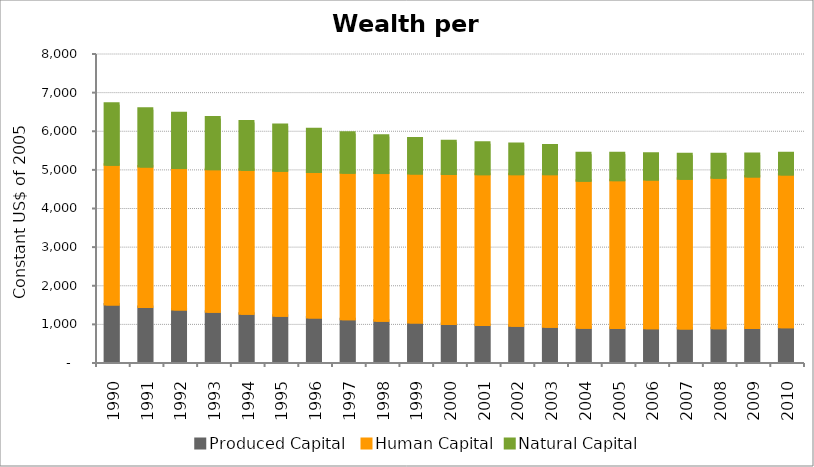
| Category | Produced Capital  | Human Capital | Natural Capital |
|---|---|---|---|
| 1990.0 | 1491.682 | 3614.805 | 1581.04 |
| 1991.0 | 1425.109 | 3634.624 | 1499.157 |
| 1992.0 | 1359.244 | 3662.099 | 1418.379 |
| 1993.0 | 1299.286 | 3693.573 | 1334.007 |
| 1994.0 | 1249.293 | 3725.413 | 1252.905 |
| 1995.0 | 1197.402 | 3753.953 | 1181.681 |
| 1996.0 | 1149.312 | 3771.936 | 1107.13 |
| 1997.0 | 1104.593 | 3797.109 | 1035.902 |
| 1998.0 | 1065.724 | 3826.1 | 968.066 |
| 1999.0 | 1023.412 | 3855.325 | 909.287 |
| 2000.0 | 986.63 | 3881.232 | 848.067 |
| 2001.0 | 959.738 | 3902.381 | 814.702 |
| 2002.0 | 937.042 | 3926.521 | 777.628 |
| 2003.0 | 911.663 | 3952.351 | 744.142 |
| 2004.0 | 889.354 | 3806.189 | 710.226 |
| 2005.0 | 880.53 | 3827.894 | 697.88 |
| 2006.0 | 874.298 | 3848.53 | 665.623 |
| 2007.0 | 868.698 | 3872.733 | 637.924 |
| 2008.0 | 872.596 | 3899.252 | 608.027 |
| 2009.0 | 877.281 | 3926.955 | 579.43 |
| 2010.0 | 900.936 | 3954.457 | 552.139 |